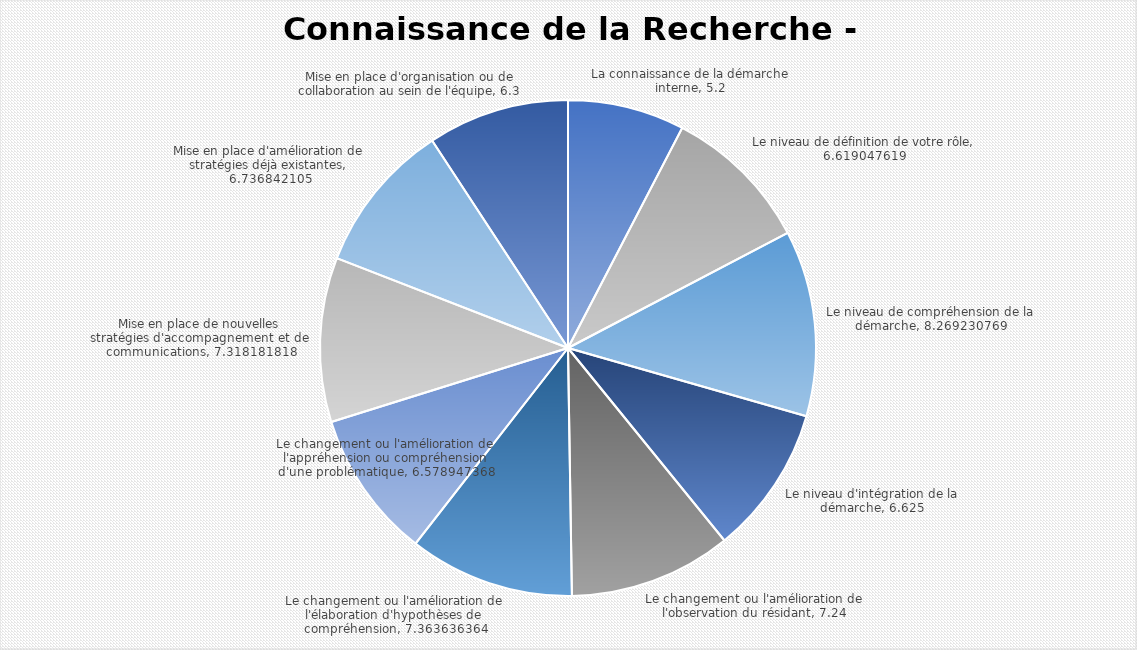
| Category | Series 0 |
|---|---|
| La connaissance de la démarche interne | 5.2 |
| Le niveau de définition de votre rôle | 6.619 |
| Le niveau de compréhension de la démarche | 8.269 |
| Le niveau d'intégration de la démarche | 6.625 |
| Le changement ou l'amélioration de l'observation du résidant | 7.24 |
| Le changement ou l'amélioration de l'élaboration d'hypothèses de compréhension | 7.364 |
| Le changement ou l'amélioration de l'appréhension ou compréhension d'une problématique | 6.579 |
| Mise en place de nouvelles stratégies d'accompagnement et de communications | 7.318 |
| Mise en place d'amélioration de stratégies déjà existantes | 6.737 |
| Mise en place d'organisation ou de collaboration au sein de l'équipe | 6.3 |